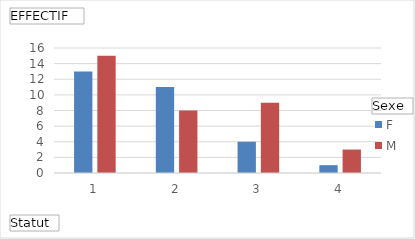
| Category | F | M |
|---|---|---|
| 1 | 13 | 15 |
| 2 | 11 | 8 |
| 3 | 4 | 9 |
| 4 | 1 | 3 |